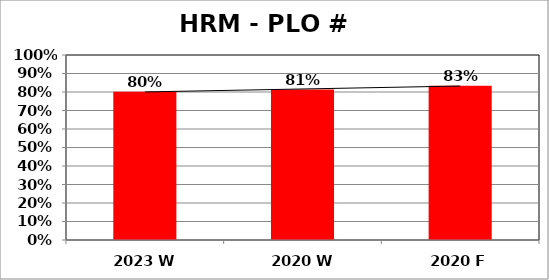
| Category | N/A |
|---|---|
| 2023 W | 0.802 |
| 2020 W | 0.813 |
| 2020 F | 0.834 |